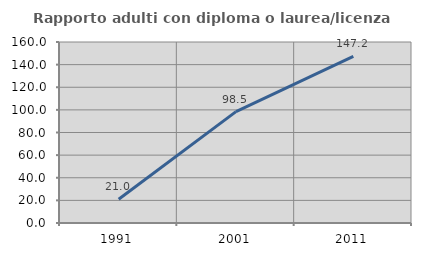
| Category | Rapporto adulti con diploma o laurea/licenza media  |
|---|---|
| 1991.0 | 20.998 |
| 2001.0 | 98.482 |
| 2011.0 | 147.21 |